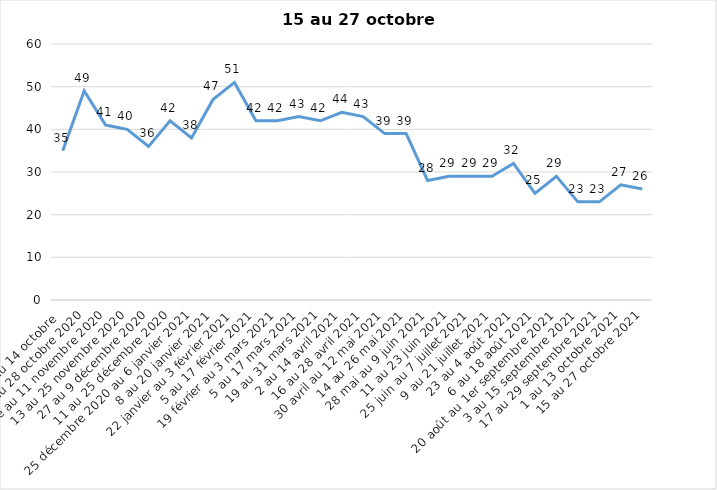
| Category | Toujours aux trois mesures |
|---|---|
| 2 au 14 octobre  | 35 |
| 16 au 28 octobre 2020 | 49 |
| 30 octobre au 11 novembre 2020 | 41 |
| 13 au 25 novembre 2020 | 40 |
| 27 au 9 décembre 2020 | 36 |
| 11 au 25 décembre 2020 | 42 |
| 25 décembre 2020 au 6 janvier 2021 | 38 |
| 8 au 20 janvier 2021 | 47 |
| 22 janvier au 3 février 2021 | 51 |
| 5 au 17 février 2021 | 42 |
| 19 février au 3 mars 2021 | 42 |
| 5 au 17 mars 2021 | 43 |
| 19 au 31 mars 2021 | 42 |
| 2 au 14 avril 2021 | 44 |
| 16 au 28 avril 2021 | 43 |
| 30 avril au 12 mai 2021 | 39 |
| 14 au 26 mai 2021 | 39 |
| 28 mai au 9 juin 2021 | 28 |
| 11 au 23 juin 2021 | 29 |
| 25 juin au 7 juillet 2021 | 29 |
| 9 au 21 juillet 2021 | 29 |
| 23 au 4 août 2021 | 32 |
| 6 au 18 août 2021 | 25 |
| 20 août au 1er septembre 2021 | 29 |
| 3 au 15 septembre 2021 | 23 |
| 17 au 29 septembre 2021 | 23 |
| 1 au 13 octobre 2021 | 27 |
| 15 au 27 octobre 2021 | 26 |